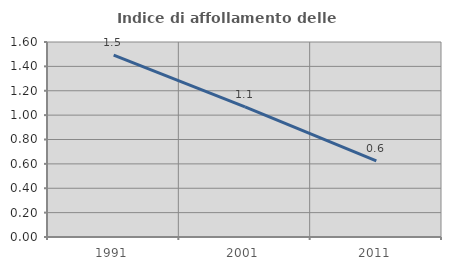
| Category | Indice di affollamento delle abitazioni  |
|---|---|
| 1991.0 | 1.493 |
| 2001.0 | 1.067 |
| 2011.0 | 0.624 |